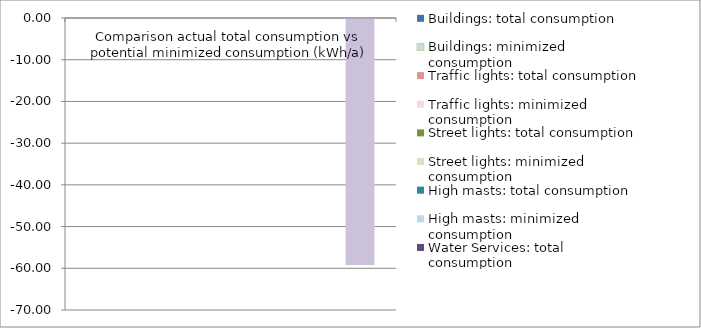
| Category | Buildings: total consumption | Buildings: minimized consumption | Traffic lights: total consumption | Traffic lights: minimized consumption | Street lights: total consumption | Street lights: minimized consumption | High masts: total consumption | High masts: minimized consumption | Water Services: total consumption | Water services: minimized consumption |
|---|---|---|---|---|---|---|---|---|---|---|
| 0 | 0 | 0 | 0 | 0 | 0 | 0 | 0 | 0 | 0 | -59 |